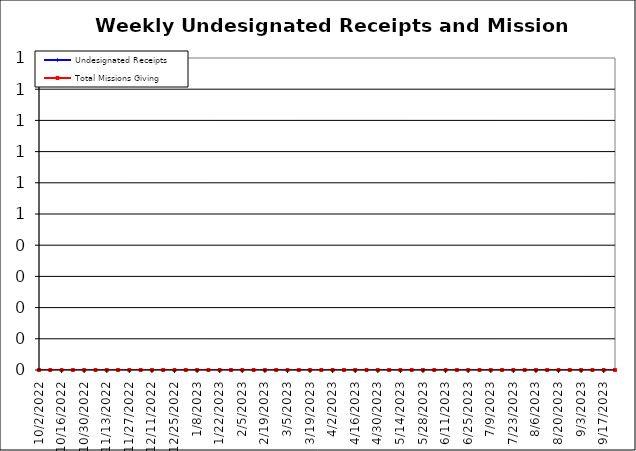
| Category | Undesignated Receipts | Total Missions Giving |
|---|---|---|
| 10/2/22 | 0 | 0 |
| 10/9/22 | 0 | 0 |
| 10/16/22 | 0 | 0 |
| 10/23/22 | 0 | 0 |
| 10/30/22 | 0 | 0 |
| 11/6/22 | 0 | 0 |
| 11/13/22 | 0 | 0 |
| 11/20/22 | 0 | 0 |
| 11/27/22 | 0 | 0 |
| 12/4/22 | 0 | 0 |
| 12/11/22 | 0 | 0 |
| 12/18/22 | 0 | 0 |
| 12/25/22 | 0 | 0 |
| 1/1/23 | 0 | 0 |
| 1/8/23 | 0 | 0 |
| 1/15/23 | 0 | 0 |
| 1/22/23 | 0 | 0 |
| 1/29/23 | 0 | 0 |
| 2/5/23 | 0 | 0 |
| 2/12/23 | 0 | 0 |
| 2/19/23 | 0 | 0 |
| 2/26/23 | 0 | 0 |
| 3/5/23 | 0 | 0 |
| 3/12/23 | 0 | 0 |
| 3/19/23 | 0 | 0 |
| 3/26/23 | 0 | 0 |
| 4/2/23 | 0 | 0 |
| 4/9/23 | 0 | 0 |
| 4/16/23 | 0 | 0 |
| 4/23/23 | 0 | 0 |
| 4/30/23 | 0 | 0 |
| 5/7/23 | 0 | 0 |
| 5/14/23 | 0 | 0 |
| 5/21/23 | 0 | 0 |
| 5/28/23 | 0 | 0 |
| 6/4/23 | 0 | 0 |
| 6/11/23 | 0 | 0 |
| 6/18/23 | 0 | 0 |
| 6/25/23 | 0 | 0 |
| 7/2/23 | 0 | 0 |
| 7/9/23 | 0 | 0 |
| 7/16/23 | 0 | 0 |
| 7/23/23 | 0 | 0 |
| 7/30/23 | 0 | 0 |
| 8/6/23 | 0 | 0 |
| 8/13/23 | 0 | 0 |
| 8/20/23 | 0 | 0 |
| 8/27/23 | 0 | 0 |
| 9/3/23 | 0 | 0 |
| 9/10/23 | 0 | 0 |
| 9/17/23 | 0 | 0 |
| 9/24/23 | 0 | 0 |